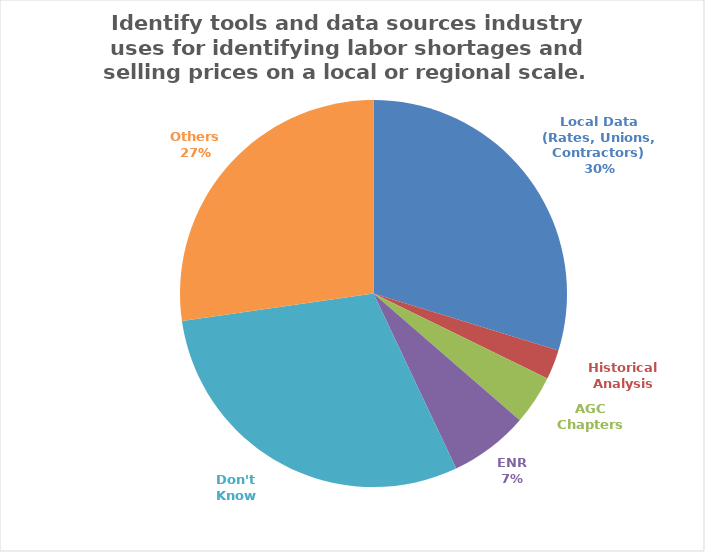
| Category | Series 0 |
|---|---|
| Local Data (Rates, Unions, Contractors) | 0.269 |
| Historical Analysis | 0.022 |
| AGC Chapters | 0.037 |
| ENR | 0.06 |
| Don't Know | 0.269 |
| Others | 0.246 |